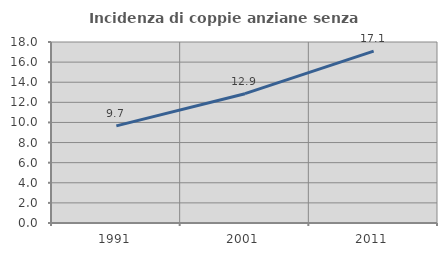
| Category | Incidenza di coppie anziane senza figli  |
|---|---|
| 1991.0 | 9.658 |
| 2001.0 | 12.861 |
| 2011.0 | 17.096 |